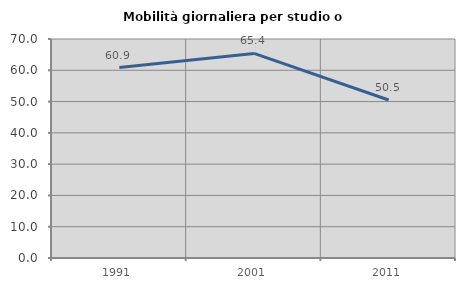
| Category | Mobilità giornaliera per studio o lavoro |
|---|---|
| 1991.0 | 60.87 |
| 2001.0 | 65.385 |
| 2011.0 | 50.505 |